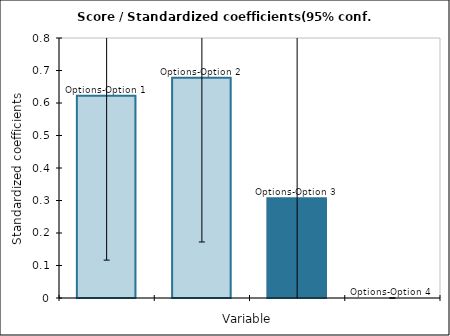
| Category | Series 0 |
|---|---|
| Options-Option 1 | 0.622 |
| Options-Option 2 | 0.678 |
| Options-Option 3 | 0.307 |
| Options-Option 4 | 0 |